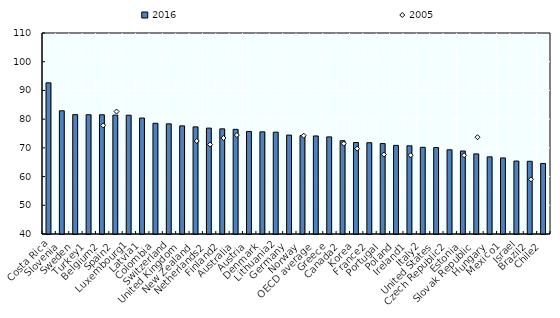
| Category | 2016 |
|---|---|
| Costa Rica | 92.646 |
| Slovenia | 82.911 |
| Sweden | 81.564 |
| Turkey1 | 81.526 |
| Belgium2 | 81.522 |
| Spain2 | 81.4 |
| Luxembourg1 | 81.367 |
| Latvia1 | 80.385 |
| Colombia | 78.563 |
| Switzerland | 78.364 |
| United Kingdom | 77.656 |
| New Zealand | 77.309 |
| Netherlands2 | 76.877 |
| Finland2 | 76.62 |
| Australia | 76.445 |
| Austria | 75.707 |
| Denmark | 75.578 |
| Lithuania2 | 75.462 |
| Germany | 74.442 |
| Norway | 74.283 |
| OECD average | 74.144 |
| Greece | 73.814 |
| Canada2 | 72.487 |
| Korea | 71.87 |
| France2 | 71.79 |
| Portugal | 71.489 |
| Poland | 70.864 |
| Ireland1 | 70.722 |
| Italy2 | 70.189 |
| United States | 70.109 |
| Czech Republic2 | 69.325 |
| Estonia | 68.906 |
| Slovak Republic | 67.897 |
| Hungary | 66.87 |
| Mexico1 | 66.484 |
| Israel | 65.412 |
| Brazil2 | 65.321 |
| Chile2 | 64.552 |